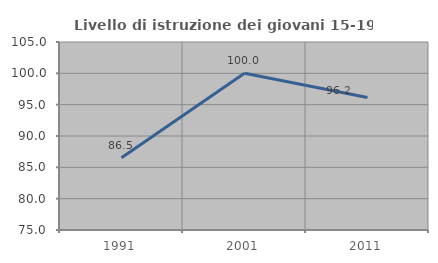
| Category | Livello di istruzione dei giovani 15-19 anni |
|---|---|
| 1991.0 | 86.538 |
| 2001.0 | 100 |
| 2011.0 | 96.154 |